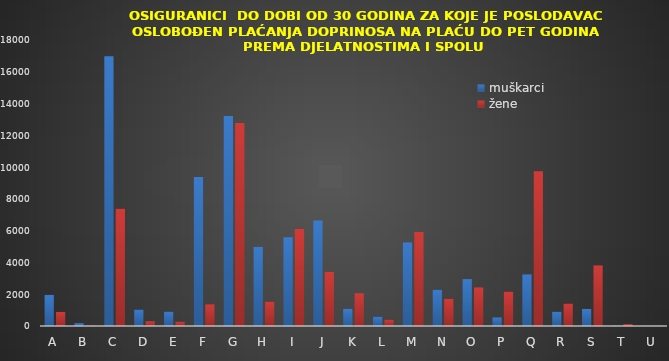
| Category | muškarci | žene |
|---|---|---|
| A | 1957 | 886 |
| B | 180 | 22 |
| C | 16976 | 7379 |
| D | 1032 | 299 |
| E | 903 | 269 |
| F | 9383 | 1361 |
| G | 13218 | 12784 |
| H | 4980 | 1535 |
| I | 5585 | 6114 |
| J | 6640 | 3398 |
| K | 1072 | 2064 |
| L | 585 | 397 |
| M | 5260 | 5918 |
| N | 2279 | 1714 |
| O | 2952 | 2426 |
| P | 537 | 2163 |
| Q | 3246 | 9736 |
| R | 895 | 1412 |
| S | 1074 | 3813 |
| T | 21 | 118 |
| U | 8 | 11 |